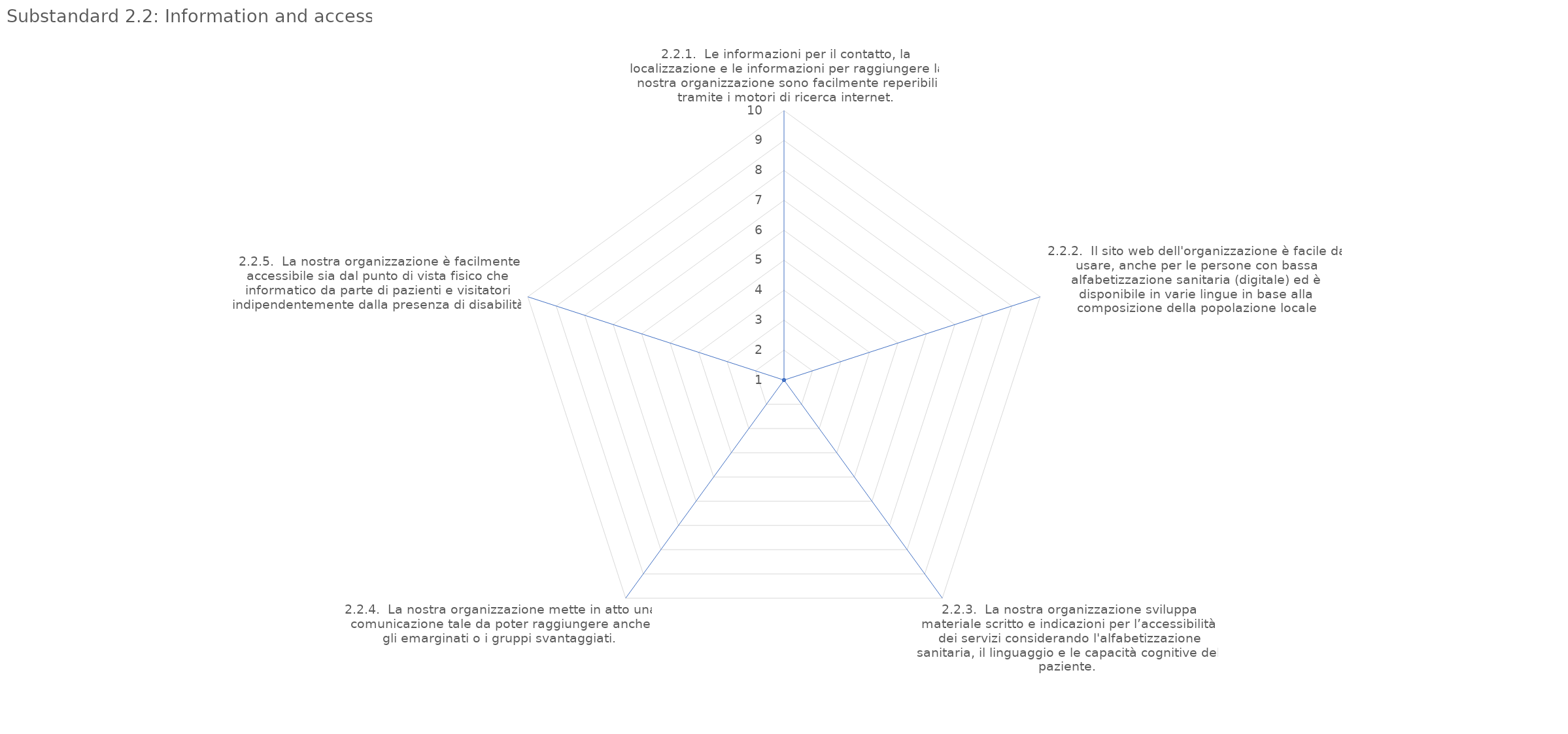
| Category | value |
|---|---|
| 2.2.1.  Le informazioni per il contatto, la localizzazione e le informazioni per raggiungere la nostra organizzazione sono facilmente reperibili tramite i motori di ricerca internet. | 1 |
| 2.2.2.  Il sito web dell'organizzazione è facile da usare, anche per le persone con bassa alfabetizzazione sanitaria (digitale) ed è disponibile in varie lingue in base alla composizione della popolazione locale | 1 |
| 2.2.3.  La nostra organizzazione sviluppa materiale scritto e indicazioni per l’accessibilità dei servizi considerando l'alfabetizzazione sanitaria, il linguaggio e le capacità cognitive del paziente. | 1 |
| 2.2.4.  La nostra organizzazione mette in atto una comunicazione tale da poter raggiungere anche gli emarginati o i gruppi svantaggiati. | 1 |
| 2.2.5.  La nostra organizzazione è facilmente accessibile sia dal punto di vista fisico che informatico da parte di pazienti e visitatori indipendentemente dalla presenza di disabilità | 1 |